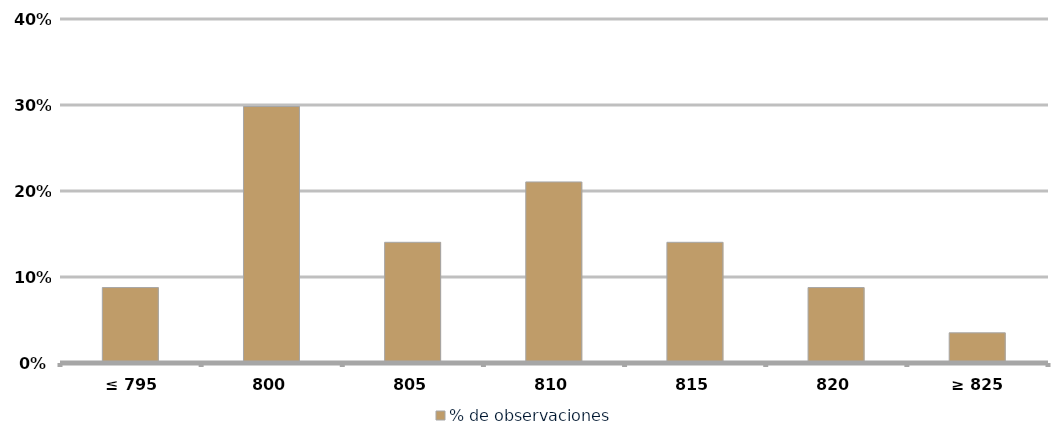
| Category | % de observaciones  |
|---|---|
|  ≤ 795  | 0.088 |
|  800  | 0.298 |
|  805  | 0.14 |
|  810  | 0.211 |
|  815  | 0.14 |
| 820 | 0.088 |
|  ≥ 825  | 0.035 |